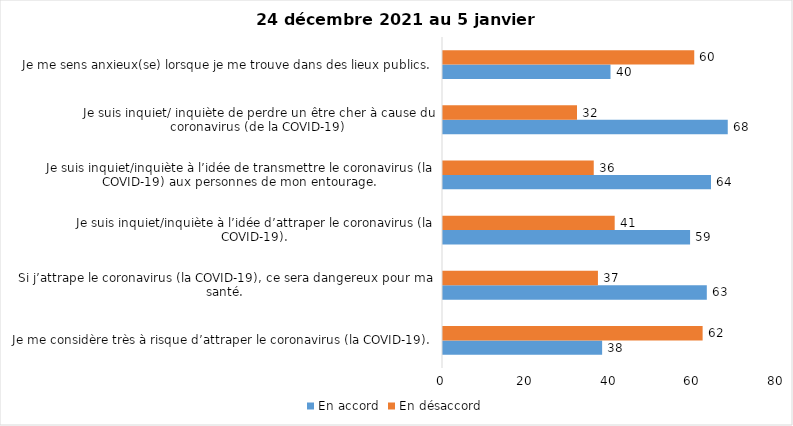
| Category | En accord | En désaccord |
|---|---|---|
| Je me considère très à risque d’attraper le coronavirus (la COVID-19). | 38 | 62 |
| Si j’attrape le coronavirus (la COVID-19), ce sera dangereux pour ma santé. | 63 | 37 |
| Je suis inquiet/inquiète à l’idée d’attraper le coronavirus (la COVID-19). | 59 | 41 |
| Je suis inquiet/inquiète à l’idée de transmettre le coronavirus (la COVID-19) aux personnes de mon entourage. | 64 | 36 |
| Je suis inquiet/ inquiète de perdre un être cher à cause du coronavirus (de la COVID-19) | 68 | 32 |
| Je me sens anxieux(se) lorsque je me trouve dans des lieux publics. | 40 | 60 |